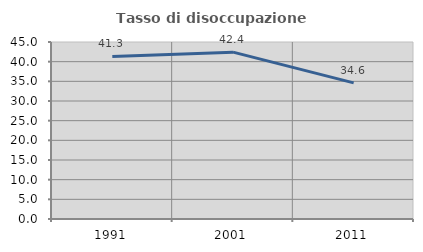
| Category | Tasso di disoccupazione giovanile  |
|---|---|
| 1991.0 | 41.333 |
| 2001.0 | 42.424 |
| 2011.0 | 34.615 |